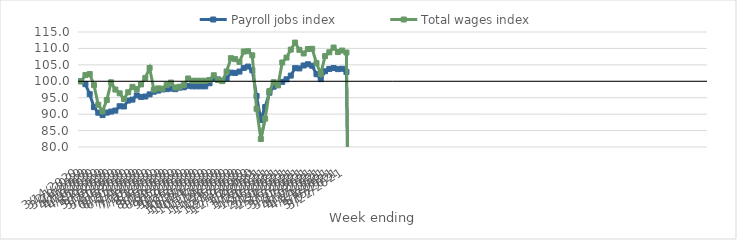
| Category | Payroll jobs index | Total wages index |
|---|---|---|
| 14/03/2020 | 100 | 100 |
| 21/03/2020 | 99.12 | 101.882 |
| 28/03/2020 | 96.081 | 102.198 |
| 04/04/2020 | 92.145 | 98.81 |
| 11/04/2020 | 90.44 | 92.854 |
| 18/04/2020 | 89.704 | 90.848 |
| 25/04/2020 | 90.463 | 94.315 |
| 02/05/2020 | 90.784 | 99.677 |
| 09/05/2020 | 91.09 | 97.485 |
| 16/05/2020 | 92.416 | 96.336 |
| 23/05/2020 | 92.336 | 94.619 |
| 30/05/2020 | 94.138 | 96.654 |
| 06/06/2020 | 94.422 | 98.307 |
| 13/06/2020 | 95.716 | 97.607 |
| 20/06/2020 | 95.246 | 99.054 |
| 27/06/2020 | 95.364 | 101.021 |
| 04/07/2020 | 96.022 | 104.053 |
| 11/07/2020 | 96.83 | 97.443 |
| 18/07/2020 | 97.159 | 97.842 |
| 25/07/2020 | 97.51 | 97.756 |
| 01/08/2020 | 97.601 | 98.894 |
| 08/08/2020 | 97.779 | 99.607 |
| 15/08/2020 | 97.597 | 98.108 |
| 22/08/2020 | 98.069 | 98.328 |
| 29/08/2020 | 98.167 | 98.847 |
| 05/09/2020 | 98.626 | 100.856 |
| 12/09/2020 | 98.463 | 100.163 |
| 19/09/2020 | 98.463 | 100.163 |
| 26/09/2020 | 98.463 | 100.163 |
| 03/10/2020 | 98.463 | 100.163 |
| 10/10/2020 | 99.397 | 100.396 |
| 17/10/2020 | 100.864 | 101.829 |
| 24/10/2020 | 100.58 | 100.373 |
| 31/10/2020 | 100.187 | 100.056 |
| 07/11/2020 | 100.877 | 102.991 |
| 14/11/2020 | 102.635 | 107.039 |
| 21/11/2020 | 102.544 | 106.733 |
| 28/11/2020 | 102.959 | 105.888 |
| 05/12/2020 | 104.07 | 109.063 |
| 12/12/2020 | 104.477 | 109.151 |
| 19/12/2020 | 103.336 | 107.902 |
| 26/12/2020 | 95.521 | 91.635 |
| 02/01/2021 | 88.243 | 82.423 |
| 09/01/2021 | 92.142 | 88.618 |
| 16/01/2021 | 96.531 | 97.02 |
| 23/01/2021 | 98.358 | 99.715 |
| 30/01/2021 | 99.045 | 98.749 |
| 06/02/2021 | 99.828 | 105.722 |
| 13/02/2021 | 100.597 | 107.215 |
| 20/02/2021 | 101.734 | 109.638 |
| 27/02/2021 | 103.999 | 111.776 |
| 06/03/2021 | 103.915 | 109.563 |
| 13/03/2021 | 104.807 | 108.467 |
| 20/03/2021 | 105.185 | 109.808 |
| 27/03/2021 | 104.73 | 109.893 |
| 03/04/2021 | 102.154 | 105.516 |
| 10/04/2021 | 100.659 | 102.232 |
| 17/04/2021 | 103.051 | 107.655 |
| 24/04/2021 | 103.754 | 108.823 |
| 01/05/2021 | 104.052 | 110.261 |
| 08/05/2021 | 103.7 | 108.887 |
| 15/05/2021 | 103.817 | 109.358 |
| 22/05/2021 | 102.833 | 108.754 |